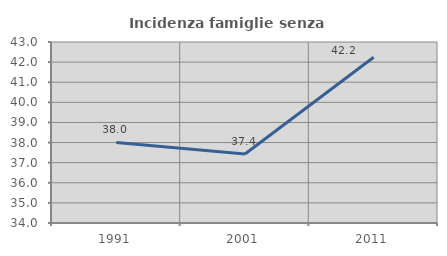
| Category | Incidenza famiglie senza nuclei |
|---|---|
| 1991.0 | 38.007 |
| 2001.0 | 37.429 |
| 2011.0 | 42.243 |